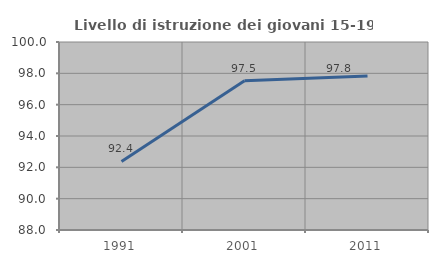
| Category | Livello di istruzione dei giovani 15-19 anni |
|---|---|
| 1991.0 | 92.376 |
| 2001.0 | 97.532 |
| 2011.0 | 97.833 |